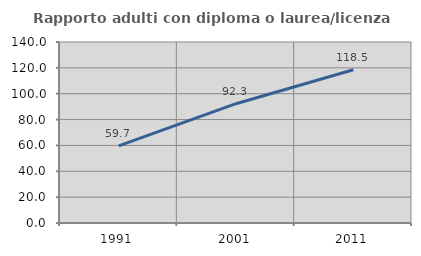
| Category | Rapporto adulti con diploma o laurea/licenza media  |
|---|---|
| 1991.0 | 59.701 |
| 2001.0 | 92.285 |
| 2011.0 | 118.487 |